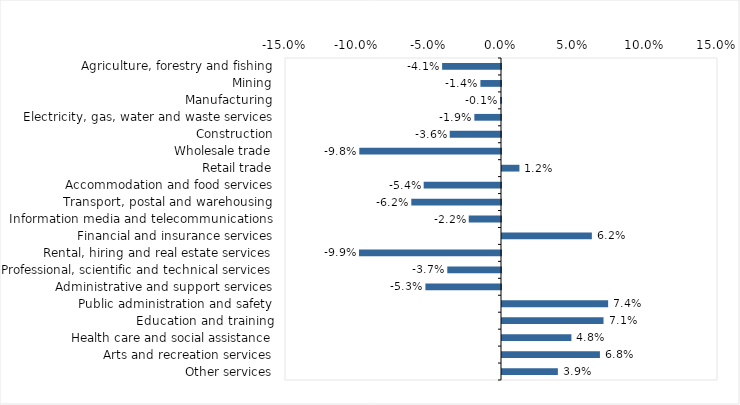
| Category | This week |
|---|---|
| Agriculture, forestry and fishing | -0.041 |
| Mining | -0.014 |
| Manufacturing | -0.001 |
| Electricity, gas, water and waste services | -0.018 |
| Construction | -0.036 |
| Wholesale trade | -0.098 |
| Retail trade | 0.012 |
| Accommodation and food services | -0.054 |
| Transport, postal and warehousing | -0.062 |
| Information media and telecommunications | -0.022 |
| Financial and insurance services | 0.062 |
| Rental, hiring and real estate services | -0.099 |
| Professional, scientific and technical services | -0.037 |
| Administrative and support services | -0.052 |
| Public administration and safety | 0.074 |
| Education and training | 0.07 |
| Health care and social assistance | 0.048 |
| Arts and recreation services | 0.068 |
| Other services | 0.039 |